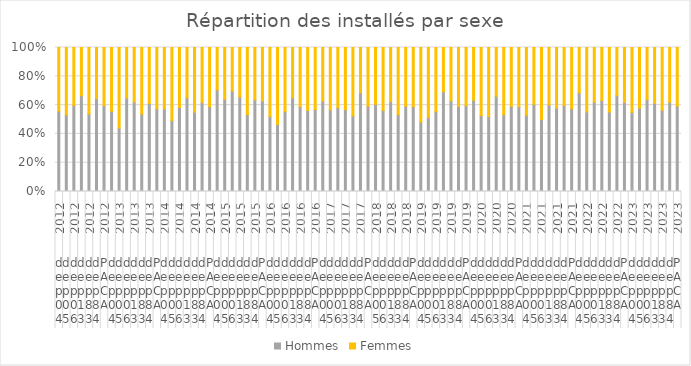
| Category | Hommes | Femmes |
|---|---|---|
| 0 | 54 | 43 |
| 1 | 42 | 37 |
| 2 | 55 | 37 |
| 3 | 123 | 62 |
| 4 | 100 | 86 |
| 5 | 87 | 48 |
| 6 | 461 | 313 |
| 7 | 54 | 43 |
| 8 | 37 | 47 |
| 9 | 48 | 26 |
| 10 | 134 | 82 |
| 11 | 108 | 93 |
| 12 | 91 | 58 |
| 13 | 471 | 349 |
| 14 | 51 | 38 |
| 15 | 34 | 35 |
| 16 | 63 | 45 |
| 17 | 113 | 61 |
| 18 | 98 | 80 |
| 19 | 103 | 64 |
| 20 | 462 | 323 |
| 21 | 67 | 28 |
| 22 | 48 | 27 |
| 23 | 62 | 27 |
| 24 | 109 | 57 |
| 25 | 111 | 97 |
| 26 | 98 | 56 |
| 27 | 495 | 292 |
| 28 | 63 | 58 |
| 29 | 42 | 48 |
| 30 | 51 | 41 |
| 31 | 106 | 57 |
| 32 | 143 | 100 |
| 33 | 107 | 83 |
| 34 | 512 | 387 |
| 35 | 57 | 34 |
| 36 | 47 | 36 |
| 37 | 50 | 36 |
| 38 | 107 | 81 |
| 39 | 86 | 78 |
| 40 | 109 | 50 |
| 41 | 456 | 315 |
| 42 | 43 | 28 |
| 43 | 36 | 28 |
| 44 | 98 | 59 |
| 45 | 105 | 92 |
| 46 | 112 | 77 |
| 47 | 453 | 317 |
| 48 | 51 | 55 |
| 49 | 36 | 34 |
| 50 | 36 | 29 |
| 51 | 117 | 52 |
| 52 | 97 | 57 |
| 53 | 102 | 71 |
| 54 | 439 | 298 |
| 55 | 71 | 41 |
| 56 | 39 | 35 |
| 57 | 39 | 36 |
| 58 | 115 | 59 |
| 59 | 97 | 85 |
| 60 | 107 | 74 |
| 61 | 468 | 329 |
| 62 | 64 | 57 |
| 63 | 52 | 34 |
| 64 | 38 | 38 |
| 65 | 90 | 60 |
| 66 | 96 | 70 |
| 67 | 98 | 66 |
| 68 | 438 | 325 |
| 69 | 85 | 39 |
| 70 | 53 | 43 |
| 71 | 49 | 30 |
| 72 | 120 | 70 |
| 73 | 111 | 90 |
| 74 | 135 | 68 |
| 75 | 553 | 340 |
| 76 | 67 | 55 |
| 77 | 44 | 32 |
| 78 | 58 | 33 |
| 79 | 98 | 62 |
| 80 | 102 | 79 |
| 81 | 106 | 65 |
| 82 | 475 | 326 |